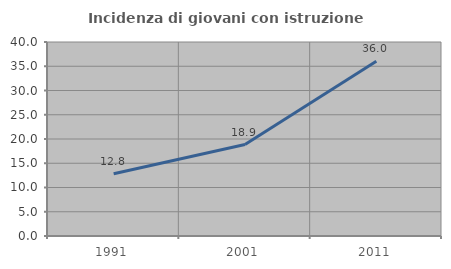
| Category | Incidenza di giovani con istruzione universitaria |
|---|---|
| 1991.0 | 12.83 |
| 2001.0 | 18.851 |
| 2011.0 | 36.043 |